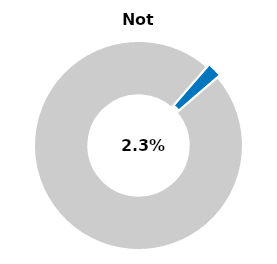
| Category | Series 0 |
|---|---|
| Not passed | 0.023 |
| Other | 0.977 |